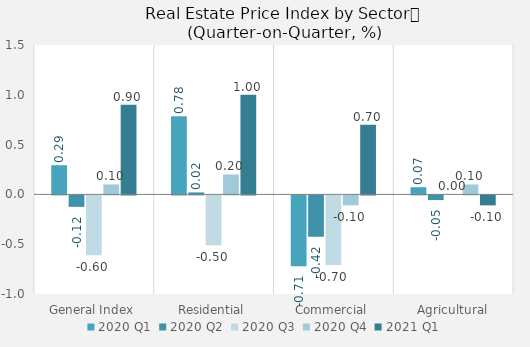
| Category | 2020 | 2021 |
|---|---|---|
| General Index | 0.1 | 0.9 |
| Residential | 0.2 | 1 |
| Commercial | -0.1 | 0.7 |
| Agricultural | 0.1 | -0.1 |